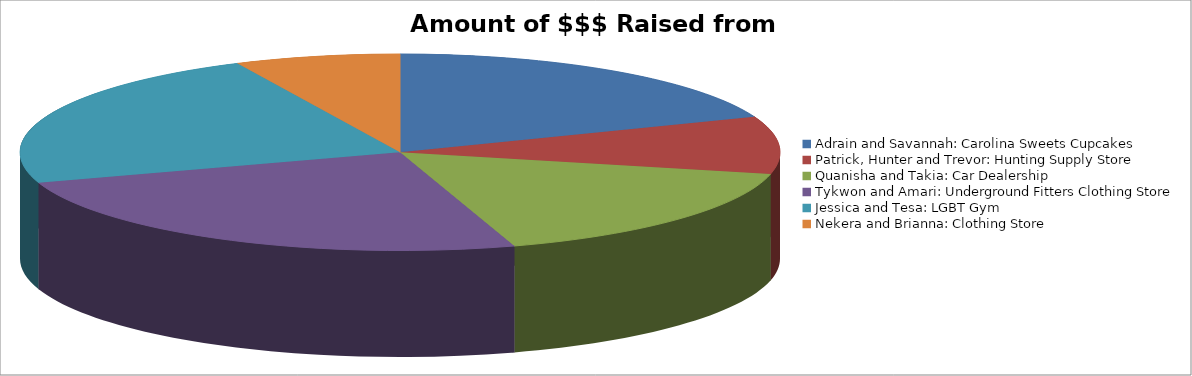
| Category | Amount of $$$ Raised from Investors |
|---|---|
| Adrain and Savannah: Carolina Sweets Cupcakes | 90000 |
| Patrick, Hunter and Trevor: Hunting Supply Store | 44500 |
| Quanisha and Takia: Car Dealership | 78000 |
| Tykwon and Amari: Underground Fitters Clothing Store | 117000 |
| Jessica and Tesa: LGBT Gym | 108200 |
| Nekera and Brianna: Clothing Store | 33100 |